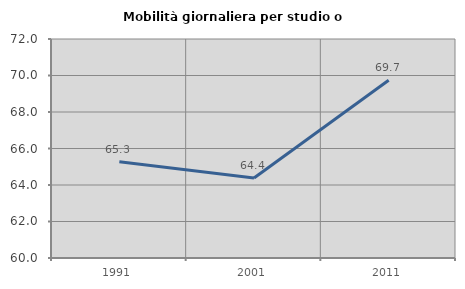
| Category | Mobilità giornaliera per studio o lavoro |
|---|---|
| 1991.0 | 65.269 |
| 2001.0 | 64.387 |
| 2011.0 | 69.742 |